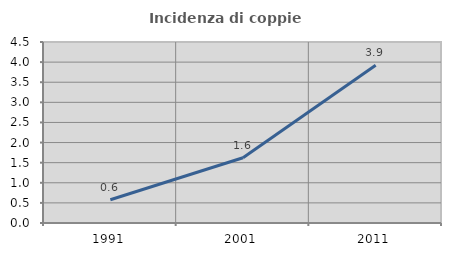
| Category | Incidenza di coppie miste |
|---|---|
| 1991.0 | 0.578 |
| 2001.0 | 1.622 |
| 2011.0 | 3.922 |